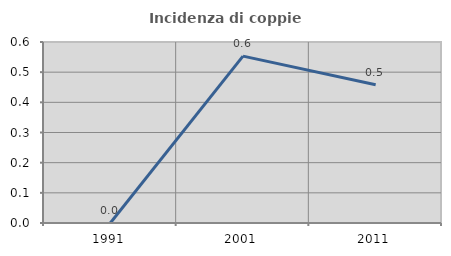
| Category | Incidenza di coppie miste |
|---|---|
| 1991.0 | 0 |
| 2001.0 | 0.553 |
| 2011.0 | 0.458 |